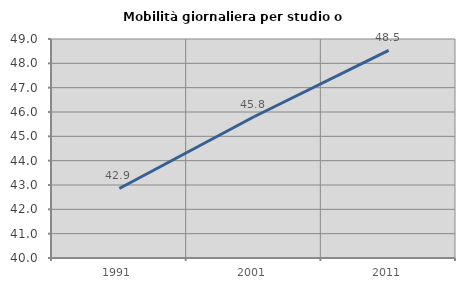
| Category | Mobilità giornaliera per studio o lavoro |
|---|---|
| 1991.0 | 42.857 |
| 2001.0 | 45.804 |
| 2011.0 | 48.534 |